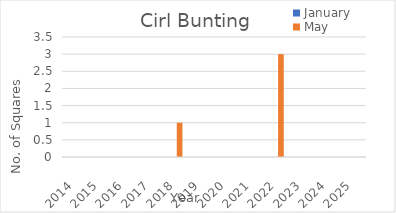
| Category | January | May |
|---|---|---|
| 2014.0 | 0 | 0 |
| 2015.0 | 0 | 0 |
| 2016.0 | 0 | 0 |
| 2017.0 | 0 | 0 |
| 2018.0 | 0 | 1 |
| 2019.0 | 0 | 0 |
| 2020.0 | 0 | 0 |
| 2021.0 | 0 | 0 |
| 2022.0 | 0 | 3 |
| 2023.0 | 0 | 0 |
| 2024.0 | 0 | 0 |
| 2025.0 | 0 | 0 |